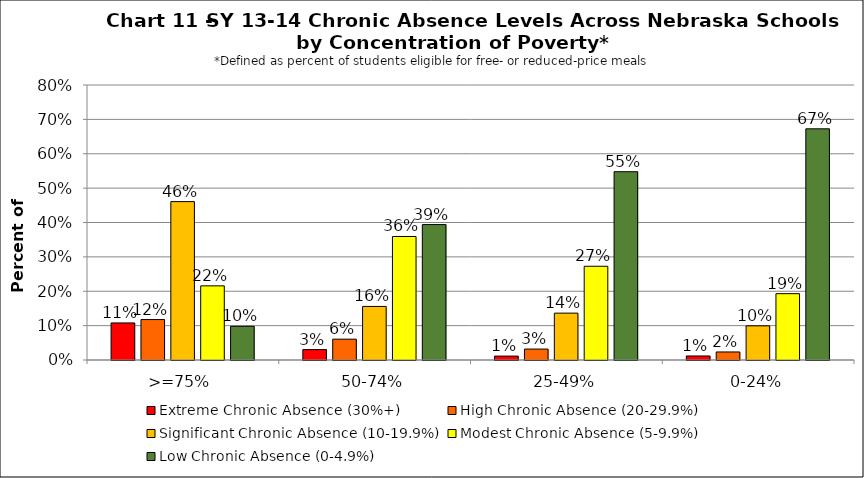
| Category | Extreme Chronic Absence (30%+) | High Chronic Absence (20-29.9%) | Significant Chronic Absence (10-19.9%) | Modest Chronic Absence (5-9.9%) | Low Chronic Absence (0-4.9%) |
|---|---|---|---|---|---|
| 0 | 0.108 | 0.118 | 0.461 | 0.216 | 0.098 |
| 1 | 0.03 | 0.061 | 0.156 | 0.359 | 0.394 |
| 2 | 0.011 | 0.032 | 0.136 | 0.273 | 0.548 |
| 3 | 0.012 | 0.023 | 0.099 | 0.193 | 0.673 |